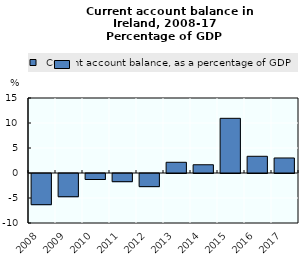
| Category |   Current account balance, as a percentage of GDP |
|---|---|
| 2008 | -6.237 |
| 2009 | -4.646 |
| 2010 | -1.2 |
| 2011 | -1.636 |
| 2012 | -2.625 |
| 2013 | 2.142 |
| 2014 | 1.65 |
| 2015 | 10.937 |
| 2016 | 3.342 |
| 2017 | 3.006 |